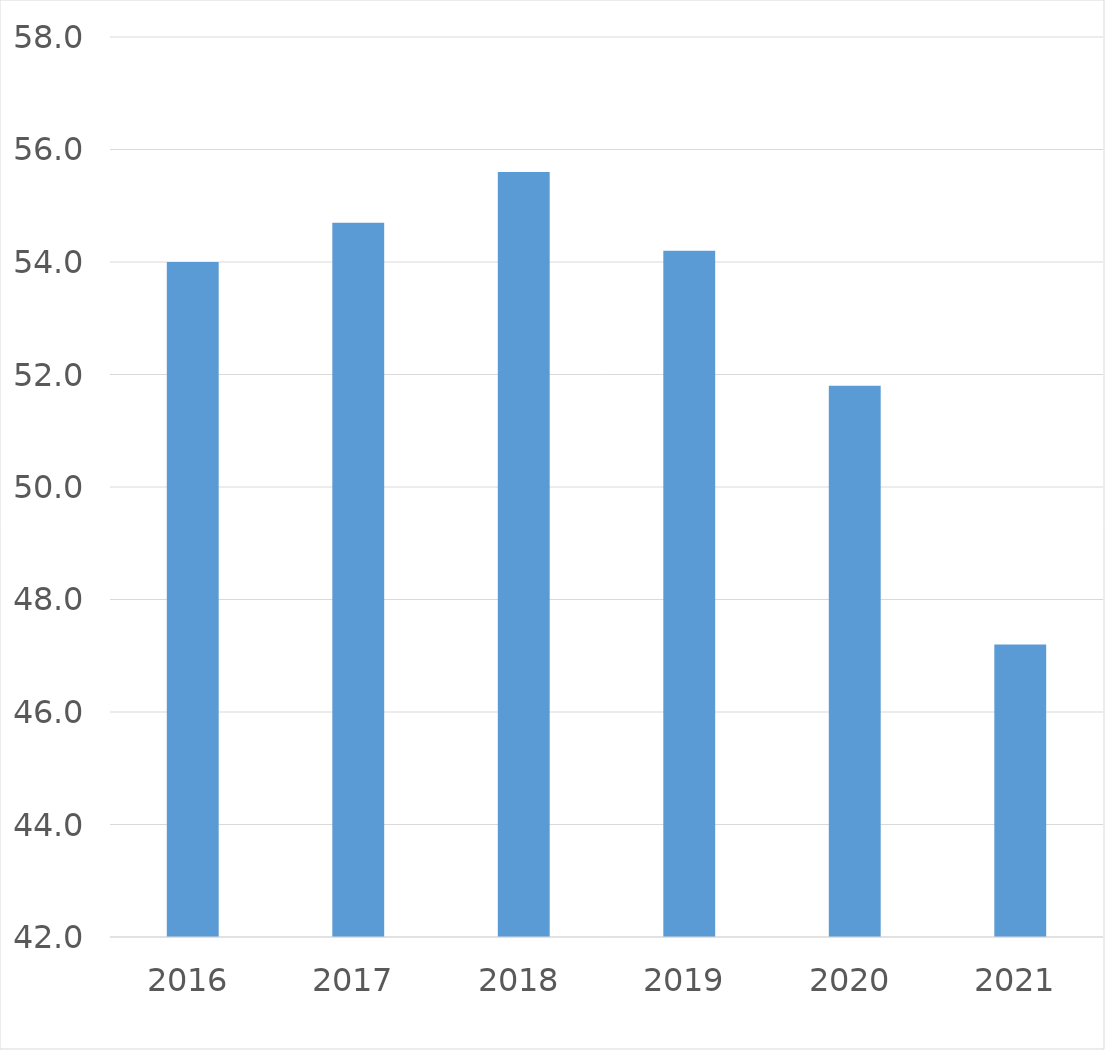
| Category | Series 0 |
|---|---|
| 2016 | 54 |
| 2017 | 54.7 |
| 2018 | 55.6 |
| 2019 | 54.2 |
| 2020 | 51.8 |
| 2021 | 47.2 |